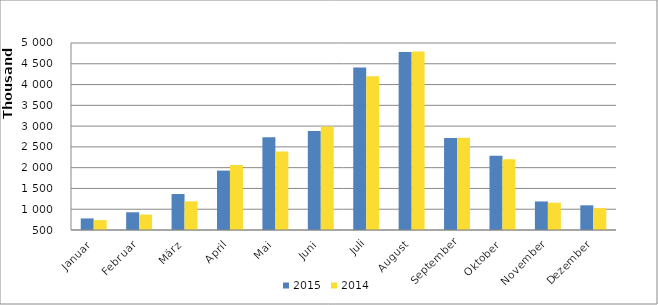
| Category | 2015 | 2014 |
|---|---|---|
| Januar | 778546 | 737949 |
| Februar | 926462 | 871166 |
| März | 1365025 | 1189766 |
| April | 1929786 | 2064644 |
| Mai | 2729242 | 2391127 |
| Juni | 2880133 | 2991121 |
| Juli | 4408772 | 4198952 |
| August | 4784368 | 4795961 |
| September | 2714427 | 2717745 |
| Oktober | 2285457 | 2205424 |
| November | 1186883 | 1157366 |
| Dezember | 1093896 | 1026149 |